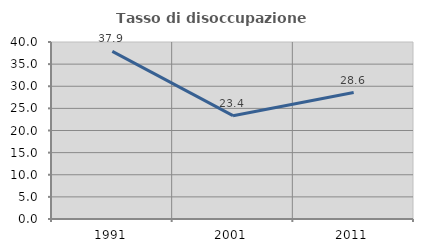
| Category | Tasso di disoccupazione giovanile  |
|---|---|
| 1991.0 | 37.877 |
| 2001.0 | 23.354 |
| 2011.0 | 28.571 |